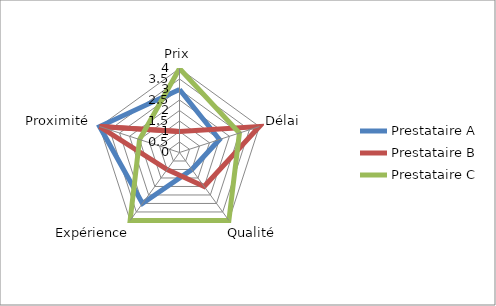
| Category | Prestataire A | Prestataire B | Prestataire C |
|---|---|---|---|
| Prix | 3 | 1 | 4 |
| Délai | 2 | 4 | 3 |
| Qualité | 1 | 2 | 4 |
| Expérience | 3 | 1 | 4 |
| Proximité | 4 | 4 | 2 |